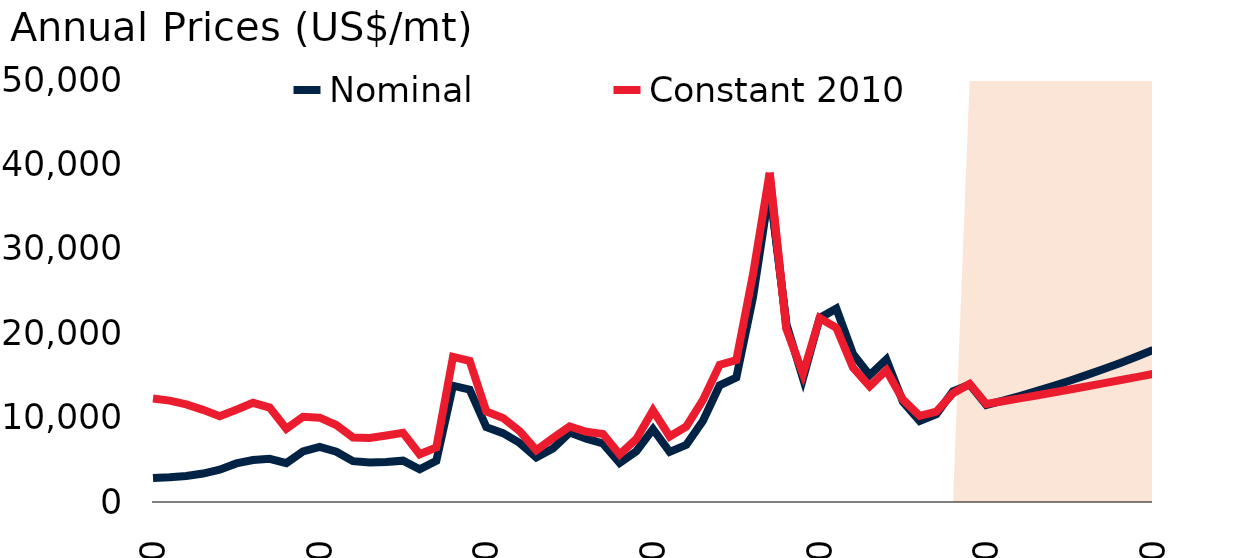
| Category | Nominal  | Constant 2010 |
|---|---|---|
| 1970.0 | 2846.2 | 12260.384 |
| 1971.0 | 2932.1 | 12009.593 |
| 1972.0 | 3079.9 | 11564.374 |
| 1973.0 | 3373.1 | 10920.917 |
| 1974.0 | 3825.25 | 10162.742 |
| 1975.0 | 4571.333 | 10935.46 |
| 1976.0 | 4973.083 | 11752.262 |
| 1977.0 | 5118.167 | 11189.134 |
| 1978.0 | 4609.25 | 8670.894 |
| 1979.0 | 5986 | 10094.668 |
| 1980.0 | 6518.675 | 9994.235 |
| 1981.0 | 5953.083 | 9116.675 |
| 1982.0 | 4837.492 | 7635.66 |
| 1983.0 | 4672.8 | 7576.627 |
| 1984.0 | 4752.208 | 7878.774 |
| 1985.0 | 4899.042 | 8207.803 |
| 1986.0 | 3881.242 | 5653.61 |
| 1987.0 | 4872.217 | 6476.409 |
| 1988.0 | 13778.317 | 17198.57 |
| 1989.0 | 13308.175 | 16711.856 |
| 1990.0 | 8864.1 | 10721.964 |
| 1991.0 | 8155.617 | 9956.544 |
| 1992.0 | 7001.229 | 8390.419 |
| 1993.0 | 5293.419 | 6132.135 |
| 1994.0 | 6339.82 | 7571.75 |
| 1995.0 | 8228.039 | 8951.301 |
| 1996.0 | 7500.817 | 8318.655 |
| 1997.0 | 6927.386 | 8062.4 |
| 1998.0 | 4629.523 | 5634.016 |
| 1999.0 | 6011.228 | 7458.896 |
| 2000.0 | 8637.739 | 10856.938 |
| 2001.0 | 5944.727 | 7763.083 |
| 2002.0 | 6771.751 | 8947.542 |
| 2003.0 | 9629.468 | 12094.592 |
| 2004.0 | 13823.241 | 16257.649 |
| 2005.0 | 14743.959 | 16810.983 |
| 2006.0 | 24254.409 | 26971.474 |
| 2007.0 | 37229.807 | 39012.803 |
| 2008.0 | 21110.645 | 20528.876 |
| 2009.0 | 14654.63 | 15192.11 |
| 2010.0 | 21808.852 | 21808.852 |
| 2011.0 | 22910.357 | 20640.752 |
| 2012.0 | 17547.546 | 15926.952 |
| 2013.0 | 15031.797 | 13703.327 |
| 2014.0 | 16893.376 | 15610.583 |
| 2015.0 | 11862.635 | 12122.299 |
| 2016.0 | 9595.179 | 10203.984 |
| 2017.0 | 10409.635 | 10696.152 |
| 2018.0 | 13114.064 | 12884.755 |
| 2019.0 | 13913.908 | 13986.917 |
| 2020.0 | 11500 | 11617.391 |
| 2021.0 | 12000 | 11931.891 |
| 2022.0 | 12552.983 | 12276.025 |
| 2023.0 | 13131.449 | 12622.728 |
| 2024.0 | 13736.571 | 12973.092 |
| 2025.0 | 14369.578 | 13327.863 |
| 2026.0 | 15031.756 | 13687.571 |
| 2027.0 | 15724.448 | 14052.608 |
| 2028.0 | 16449.061 | 14423.263 |
| 2029.0 | 17207.065 | 14799.749 |
| 2030.0 | 18000 | 15182.225 |